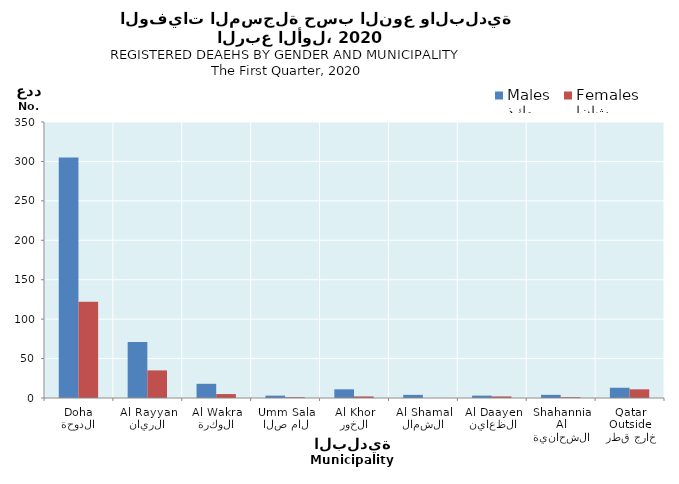
| Category | ذكور
Males | إناث
Females |
|---|---|---|
| الدوحة
Doha | 305 | 122 |
| الريان
Al Rayyan | 71 | 35 |
| الوكرة
Al Wakra | 18 | 5 |
| ام صلال
Umm Salal | 3 | 1 |
| الخور
Al Khor | 11 | 2 |
| الشمال
Al Shamal | 4 | 0 |
| الظعاين
Al Daayen | 3 | 2 |
| الشحانية
Al Shahannia | 4 | 1 |
| خارج قطر
Outside Qatar | 13 | 11 |